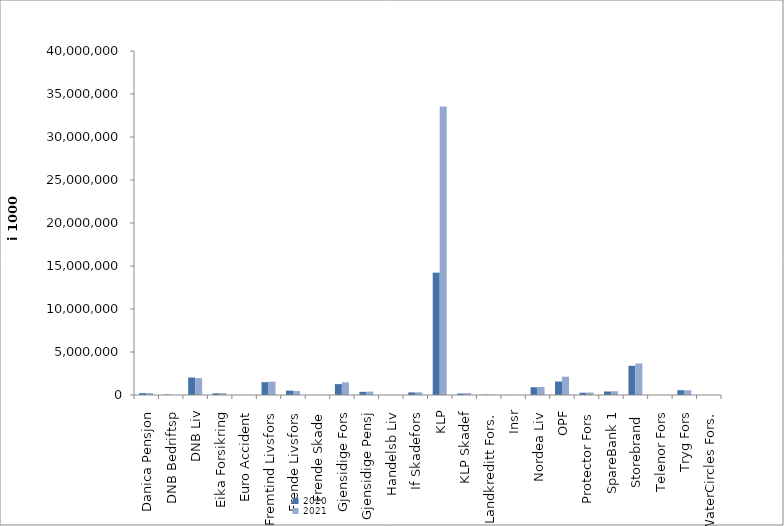
| Category | 2020 | 2021 |
|---|---|---|
| Danica Pensjon | 216417.99 | 216101.857 |
| DNB Bedriftsp | 50104 | 0 |
| DNB Liv | 2034045.995 | 1956247.765 |
| Eika Forsikring | 196946 | 213759 |
| Euro Accident | 0 | 8868.24 |
| Fremtind Livsfors | 1494137.587 | 1554860.001 |
| Frende Livsfors | 505403 | 460428 |
| Frende Skade | 622.013 | 5314.415 |
| Gjensidige Fors | 1264393 | 1474212.797 |
| Gjensidige Pensj | 362148.4 | 395870 |
| Handelsb Liv | 17644.03 | 17644.03 |
| If Skadefors | 301902.741 | 315101.852 |
| KLP | 14225527.383 | 33537381.219 |
| KLP Skadef | 173861.997 | 219490.814 |
| Landkreditt Fors. | 36699 | 39431 |
| Insr | 8168 | 0 |
| Nordea Liv | 903440.008 | 935655.99 |
| OPF | 1571000 | 2128000 |
| Protector Fors | 263606.182 | 285507.815 |
| SpareBank 1 | 405824.042 | 435411.445 |
| Storebrand  | 3394274.729 | 3657110.181 |
| Telenor Fors | 0 | 686 |
| Tryg Fors | 558832.357 | 545103.8 |
| WaterCircles Fors. | 1120 | 1684 |